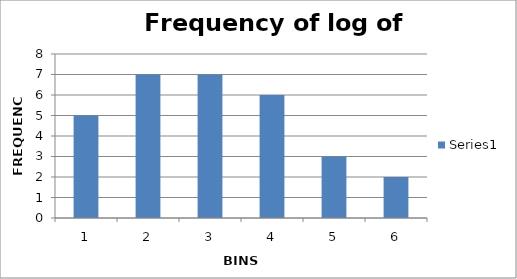
| Category | Series 0 |
|---|---|
| 0 | 5 |
| 1 | 7 |
| 2 | 7 |
| 3 | 6 |
| 4 | 3 |
| 5 | 2 |